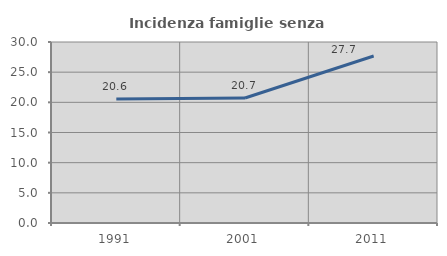
| Category | Incidenza famiglie senza nuclei |
|---|---|
| 1991.0 | 20.569 |
| 2001.0 | 20.725 |
| 2011.0 | 27.677 |